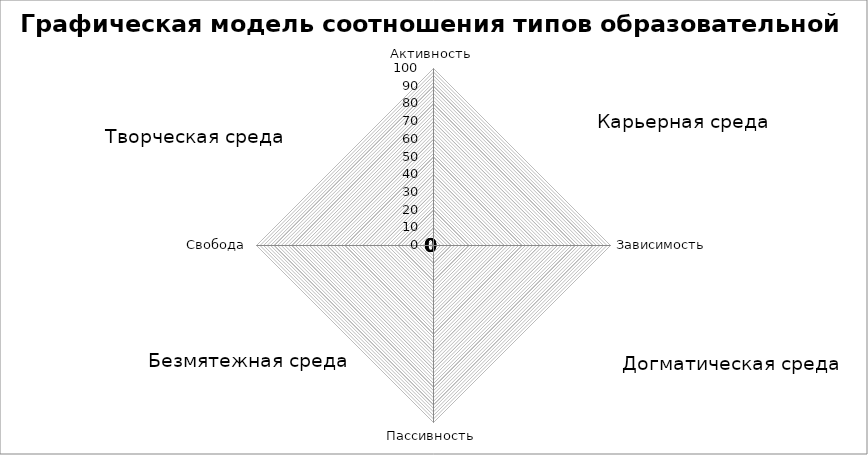
| Category | Графическая модель соотношения типов образовательной среды |
|---|---|
| Активность | 0 |
| Зависимость | 0 |
| Пассивность | 0 |
| Свобода | 0 |